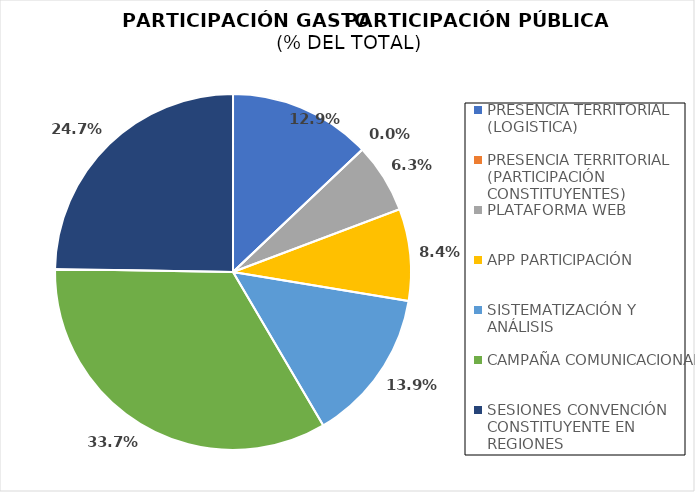
| Category | Participación en el Total |
|---|---|
| PRESENCIA TERRITORIAL (LOGISTICA) | 0.129 |
| PRESENCIA TERRITORIAL (PARTICIPACIÓN CONSTITUYENTES) | 0 |
| PLATAFORMA WEB | 0.063 |
| APP PARTICIPACIÓN | 0.084 |
| SISTEMATIZACIÓN Y ANÁLISIS | 0.139 |
| CAMPAÑA COMUNICACIONAL | 0.337 |
| SESIONES CONVENCIÓN CONSTITUYENTE EN REGIONES | 0.247 |